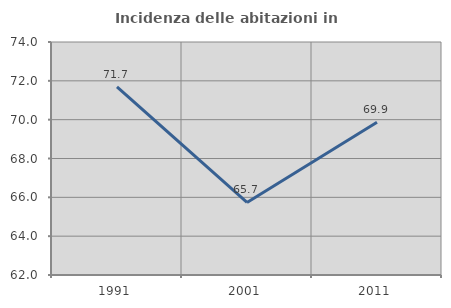
| Category | Incidenza delle abitazioni in proprietà  |
|---|---|
| 1991.0 | 71.691 |
| 2001.0 | 65.736 |
| 2011.0 | 69.865 |